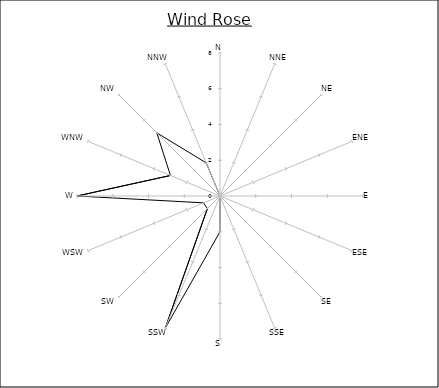
| Category | Series 0 |
|---|---|
| N | 0 |
| NNE | 0 |
| NE | 0 |
| ENE | 0 |
| E | 0 |
| ESE | 0 |
| SE | 1 |
| SSE | 0 |
| S | 2 |
| SSW | 8 |
| SW | 1 |
| WSW | 1 |
| W | 8 |
| WNW | 3 |
| NW | 5 |
| NNW | 2 |